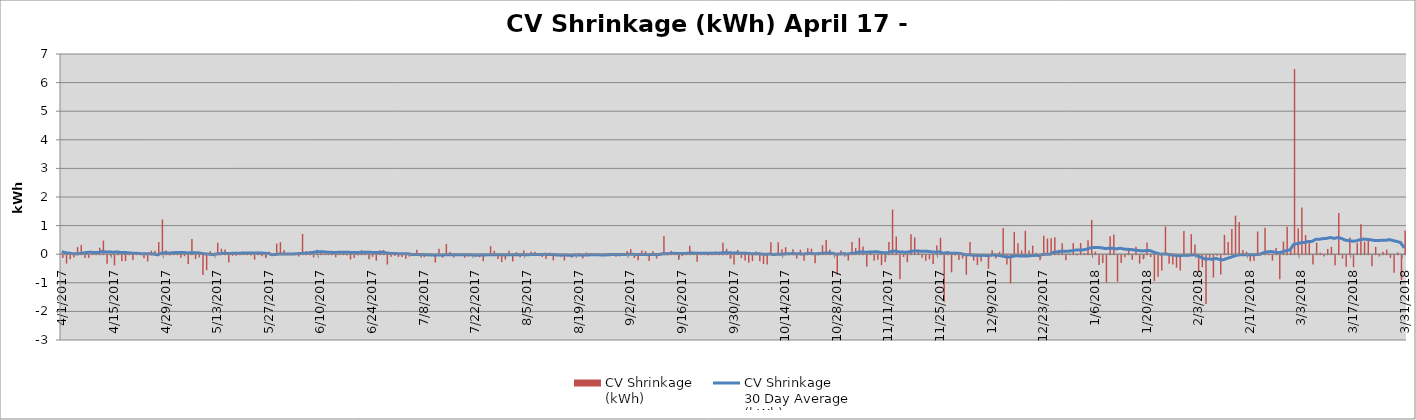
| Category | CV Shrinkage
(kWh) |
|---|---|
| 4/1/17 | -97352 |
| 4/2/17 | -291664 |
| 4/3/17 | -139929 |
| 4/4/17 | -77442 |
| 4/5/17 | 250451 |
| 4/6/17 | 323264 |
| 4/7/17 | -99347 |
| 4/8/17 | -94164 |
| 4/9/17 | 57911 |
| 4/10/17 | 39600 |
| 4/11/17 | 226881 |
| 4/12/17 | 477280 |
| 4/13/17 | -300139 |
| 4/14/17 | -40690 |
| 4/15/17 | -353110 |
| 4/16/17 | 106460 |
| 4/17/17 | -209080 |
| 4/18/17 | -205147 |
| 4/19/17 | 79883 |
| 4/20/17 | -169937 |
| 4/21/17 | 22496 |
| 4/22/17 | 47837 |
| 4/23/17 | -109047 |
| 4/24/17 | -221783 |
| 4/25/17 | 121780 |
| 4/26/17 | 117366 |
| 4/27/17 | 424047 |
| 4/28/17 | 1211131 |
| 4/29/17 | 127003 |
| 4/30/17 | -10747 |
| 5/1/17 | 99208 |
| 5/2/17 | 63765 |
| 5/3/17 | -88086 |
| 5/4/17 | -36461 |
| 5/5/17 | -309633 |
| 5/6/17 | 529582 |
| 5/7/17 | -133746 |
| 5/8/17 | -74458 |
| 5/9/17 | -695563 |
| 5/10/17 | -522046 |
| 5/11/17 | 106779 |
| 5/12/17 | 8470 |
| 5/13/17 | 399457 |
| 5/14/17 | 192199 |
| 5/15/17 | 164008 |
| 5/16/17 | -254872 |
| 5/17/17 | -22298 |
| 5/18/17 | -15911 |
| 5/19/17 | 61205 |
| 5/20/17 | 43402 |
| 5/21/17 | 19652 |
| 5/22/17 | -10960 |
| 5/23/17 | -155743 |
| 5/24/17 | 32692 |
| 5/25/17 | -34592 |
| 5/26/17 | -87478 |
| 5/27/17 | 88013 |
| 5/28/17 | -2265 |
| 5/29/17 | 369617 |
| 5/30/17 | 419599 |
| 5/31/17 | 150892 |
| 6/1/17 | 11892 |
| 6/2/17 | 24125 |
| 6/3/17 | 12942 |
| 6/4/17 | -49293 |
| 6/5/17 | 709146 |
| 6/6/17 | 109818 |
| 6/7/17 | 107911 |
| 6/8/17 | -77042 |
| 6/9/17 | 151690 |
| 6/10/17 | 91521 |
| 6/11/17 | 16568 |
| 6/12/17 | 20783 |
| 6/13/17 | 78619 |
| 6/14/17 | -71653 |
| 6/15/17 | 54647 |
| 6/16/17 | 57509 |
| 6/17/17 | -13987 |
| 6/18/17 | -151109 |
| 6/19/17 | -97743 |
| 6/20/17 | -9849 |
| 6/21/17 | 137392 |
| 6/22/17 | 62505 |
| 6/23/17 | -142016 |
| 6/24/17 | -57278 |
| 6/25/17 | -192041 |
| 6/26/17 | 141903 |
| 6/27/17 | 149299 |
| 6/28/17 | -326664 |
| 6/29/17 | -55838 |
| 6/30/17 | -26839 |
| 7/1/17 | -61494 |
| 7/2/17 | -60926 |
| 7/3/17 | -125608 |
| 7/4/17 | -49866 |
| 7/5/17 | 9374 |
| 7/6/17 | 157213 |
| 7/7/17 | -54946 |
| 7/8/17 | -69099 |
| 7/9/17 | -33168 |
| 7/10/17 | -21072 |
| 7/11/17 | -258675 |
| 7/12/17 | 191623 |
| 7/13/17 | -83705 |
| 7/14/17 | 356819 |
| 7/15/17 | 74461 |
| 7/16/17 | -82027 |
| 7/17/17 | 7492 |
| 7/18/17 | 15644 |
| 7/19/17 | -87426 |
| 7/20/17 | -47740 |
| 7/21/17 | -17465 |
| 7/22/17 | -63576 |
| 7/23/17 | -71819 |
| 7/24/17 | -214728 |
| 7/25/17 | -14873 |
| 7/26/17 | 281173 |
| 7/27/17 | 118369 |
| 7/28/17 | -134160 |
| 7/29/17 | -241134 |
| 7/30/17 | -156198 |
| 7/31/17 | 119590 |
| 8/1/17 | -217194 |
| 8/2/17 | 70589 |
| 8/3/17 | -68438 |
| 8/4/17 | 125104 |
| 8/5/17 | 8357 |
| 8/6/17 | 84740 |
| 8/7/17 | 88649 |
| 8/8/17 | 10971 |
| 8/9/17 | -58818 |
| 8/10/17 | -134061 |
| 8/11/17 | 53710 |
| 8/12/17 | -182781 |
| 8/13/17 | 28538 |
| 8/14/17 | -51581 |
| 8/15/17 | -186015 |
| 8/16/17 | -29033 |
| 8/17/17 | -91457 |
| 8/18/17 | 23727 |
| 8/19/17 | 36591 |
| 8/20/17 | -113733 |
| 8/21/17 | 58414 |
| 8/22/17 | 43489 |
| 8/23/17 | 27842 |
| 8/24/17 | -4815 |
| 8/25/17 | -7493 |
| 8/26/17 | 44388 |
| 8/27/17 | 40727 |
| 8/28/17 | 45794 |
| 8/29/17 | -54873 |
| 8/30/17 | -39738 |
| 8/31/17 | -22246 |
| 9/1/17 | 109340 |
| 9/2/17 | 183209 |
| 9/3/17 | -97516 |
| 9/4/17 | -176850 |
| 9/5/17 | 132973 |
| 9/6/17 | 106574 |
| 9/7/17 | -202592 |
| 9/8/17 | 104155 |
| 9/9/17 | -120339 |
| 9/10/17 | 47739 |
| 9/11/17 | 635058 |
| 9/12/17 | 66651 |
| 9/13/17 | 117601 |
| 9/14/17 | 31962 |
| 9/15/17 | -162746 |
| 9/16/17 | -34106 |
| 9/17/17 | 1108 |
| 9/18/17 | 293672 |
| 9/19/17 | 58096 |
| 9/20/17 | -232248 |
| 9/21/17 | 20200 |
| 9/22/17 | 59446 |
| 9/23/17 | -13055 |
| 9/24/17 | 48678 |
| 9/25/17 | 98096 |
| 9/26/17 | 53672 |
| 9/27/17 | 403403 |
| 9/28/17 | 186514 |
| 9/29/17 | -126491 |
| 9/30/17 | -322254 |
| 10/1/17 | 145309 |
| 10/2/17 | -101532 |
| 10/3/17 | -182287 |
| 10/4/17 | -267628 |
| 10/5/17 | -208734 |
| 10/6/17 | 90950 |
| 10/7/17 | -212581 |
| 10/8/17 | -308768 |
| 10/9/17 | -327637 |
| 10/10/17 | 414902 |
| 10/11/17 | 46343 |
| 10/12/17 | 417942 |
| 10/13/17 | 174731 |
| 10/14/17 | 244820 |
| 10/15/17 | 15160 |
| 10/16/17 | 169945 |
| 10/17/17 | -118671 |
| 10/18/17 | 157324 |
| 10/19/17 | -195984 |
| 10/20/17 | 208217 |
| 10/21/17 | 196371 |
| 10/22/17 | -285335 |
| 10/23/17 | 76807 |
| 10/24/17 | 316090 |
| 10/25/17 | 497580 |
| 10/26/17 | 167461 |
| 10/27/17 | 18007 |
| 10/28/17 | -680539 |
| 10/29/17 | 129368 |
| 10/30/17 | -50785 |
| 10/31/17 | -184045 |
| 11/1/17 | 422524 |
| 11/2/17 | 215182 |
| 11/3/17 | 570707 |
| 11/4/17 | 267672 |
| 11/5/17 | -395921 |
| 11/6/17 | 116529 |
| 11/7/17 | -192076 |
| 11/8/17 | -157747 |
| 11/9/17 | -350585 |
| 11/10/17 | -241149 |
| 11/11/17 | 430417 |
| 11/12/17 | 1559799 |
| 11/13/17 | 616555 |
| 11/14/17 | -841733 |
| 11/15/17 | -60180 |
| 11/16/17 | -245692 |
| 11/17/17 | 701637 |
| 11/18/17 | 589464 |
| 11/19/17 | 158535 |
| 11/20/17 | -92009 |
| 11/21/17 | -193623 |
| 11/22/17 | -145027 |
| 11/23/17 | -304358 |
| 11/24/17 | 304667 |
| 11/25/17 | 575152 |
| 11/26/17 | -1631241 |
| 11/27/17 | 93246 |
| 11/28/17 | -600580 |
| 11/29/17 | -8689 |
| 11/30/17 | -167618 |
| 12/1/17 | -112130 |
| 12/2/17 | -684593 |
| 12/3/17 | 423823 |
| 12/4/17 | -190991 |
| 12/5/17 | -343632 |
| 12/6/17 | -222173 |
| 12/7/17 | -33806 |
| 12/8/17 | -474690 |
| 12/9/17 | 134716 |
| 12/10/17 | -114733 |
| 12/11/17 | 81776 |
| 12/12/17 | 914368 |
| 12/13/17 | -326653 |
| 12/14/17 | -981790 |
| 12/15/17 | 781575 |
| 12/16/17 | 385957 |
| 12/17/17 | 130482 |
| 12/18/17 | 820250 |
| 12/19/17 | 126068 |
| 12/20/17 | 298658 |
| 12/21/17 | 50209 |
| 12/22/17 | -174594 |
| 12/23/17 | 644358 |
| 12/24/17 | 546371 |
| 12/25/17 | 554308 |
| 12/26/17 | 596982 |
| 12/27/17 | 148681 |
| 12/28/17 | 381907 |
| 12/29/17 | -179343 |
| 12/30/17 | 17062 |
| 12/31/17 | 387788 |
| 1/1/18 | -11317 |
| 1/2/18 | 386837 |
| 1/3/18 | 34375 |
| 1/4/18 | 489689 |
| 1/5/18 | 1199031 |
| 1/6/18 | 91608 |
| 1/7/18 | -344438 |
| 1/8/18 | -275697 |
| 1/9/18 | -958325 |
| 1/10/18 | 630872 |
| 1/11/18 | 691291 |
| 1/12/18 | -927516 |
| 1/13/18 | -276872 |
| 1/14/18 | -75907 |
| 1/15/18 | 137710 |
| 1/16/18 | -159529 |
| 1/17/18 | 257122 |
| 1/18/18 | -294946 |
| 1/19/18 | -142044 |
| 1/20/18 | 408242 |
| 1/21/18 | -64988 |
| 1/22/18 | -907689 |
| 1/23/18 | -751379 |
| 1/24/18 | -537070 |
| 1/25/18 | 966003 |
| 1/26/18 | -299974 |
| 1/27/18 | -322353 |
| 1/28/18 | -435591 |
| 1/29/18 | -532522 |
| 1/30/18 | 815332 |
| 1/31/18 | -42446 |
| 2/1/18 | 701614 |
| 2/2/18 | 337674 |
| 2/3/18 | -587665 |
| 2/4/18 | -421687 |
| 2/5/18 | -1705872 |
| 2/6/18 | -62654 |
| 2/7/18 | -782531 |
| 2/8/18 | -23203 |
| 2/9/18 | -674574 |
| 2/10/18 | 676655 |
| 2/11/18 | 426173 |
| 2/12/18 | 877551 |
| 2/13/18 | 1348432 |
| 2/14/18 | 1128626 |
| 2/15/18 | 147961 |
| 2/16/18 | 88159 |
| 2/17/18 | -213632 |
| 2/18/18 | -194339 |
| 2/19/18 | 795577 |
| 2/20/18 | 78831 |
| 2/21/18 | 921579 |
| 2/22/18 | 19272 |
| 2/23/18 | -189000 |
| 2/24/18 | 217096 |
| 2/25/18 | -838945 |
| 2/26/18 | 441875 |
| 2/27/18 | 960702 |
| 2/28/18 | 187569 |
| 3/1/18 | 6475885 |
| 3/2/18 | 905463 |
| 3/3/18 | 1631669 |
| 3/4/18 | 672934 |
| 3/5/18 | 441360 |
| 3/6/18 | -326808 |
| 3/7/18 | 405746 |
| 3/8/18 | 53595 |
| 3/9/18 | -42239 |
| 3/10/18 | 183166 |
| 3/11/18 | 256517 |
| 3/12/18 | -353858 |
| 3/13/18 | 1440796 |
| 3/14/18 | -117728 |
| 3/15/18 | -407541 |
| 3/16/18 | 581409 |
| 3/17/18 | -417869 |
| 3/18/18 | 388890 |
| 3/19/18 | 1050787 |
| 3/20/18 | 435082 |
| 3/21/18 | 487925 |
| 3/22/18 | -386723 |
| 3/23/18 | 261174 |
| 3/24/18 | -45664 |
| 3/25/18 | 87431 |
| 3/26/18 | 160981 |
| 3/27/18 | -95698 |
| 3/28/18 | -615907 |
| 3/29/18 | 59013 |
| 3/30/18 | -870712 |
| 3/31/18 | 825619 |